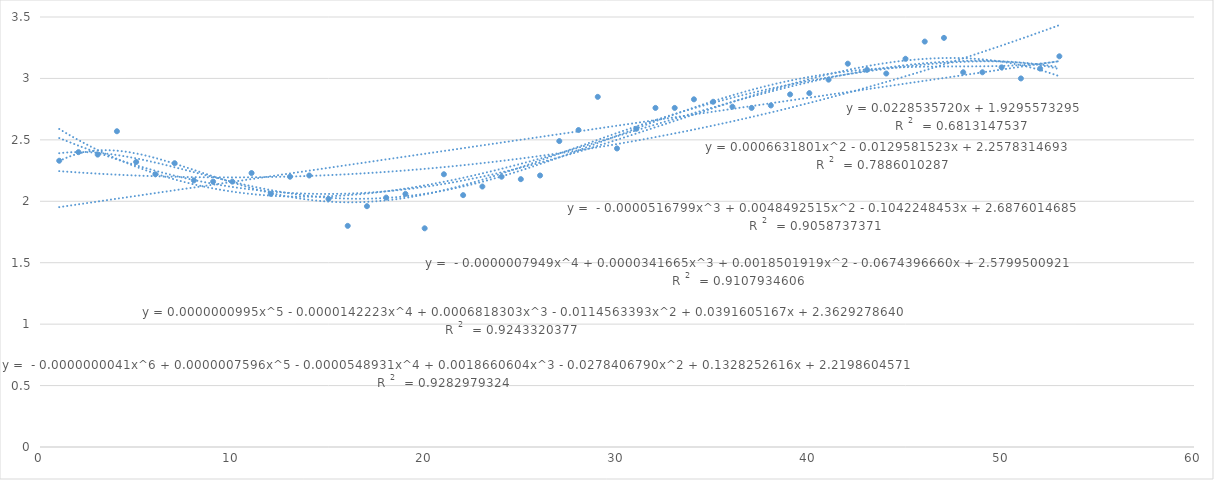
| Category | Series 0 |
|---|---|
| 1.0 | 2.33 |
| 2.0 | 2.4 |
| 3.0 | 2.38 |
| 4.0 | 2.57 |
| 5.0 | 2.32 |
| 6.0 | 2.22 |
| 7.0 | 2.31 |
| 8.0 | 2.17 |
| 9.0 | 2.16 |
| 10.0 | 2.16 |
| 11.0 | 2.23 |
| 12.0 | 2.06 |
| 13.0 | 2.2 |
| 14.0 | 2.21 |
| 15.0 | 2.02 |
| 16.0 | 1.8 |
| 17.0 | 1.96 |
| 18.0 | 2.03 |
| 19.0 | 2.06 |
| 20.0 | 1.78 |
| 21.0 | 2.22 |
| 22.0 | 2.05 |
| 23.0 | 2.12 |
| 24.0 | 2.2 |
| 25.0 | 2.18 |
| 26.0 | 2.21 |
| 27.0 | 2.49 |
| 28.0 | 2.58 |
| 29.0 | 2.85 |
| 30.0 | 2.43 |
| 31.0 | 2.59 |
| 32.0 | 2.76 |
| 33.0 | 2.76 |
| 34.0 | 2.83 |
| 35.0 | 2.81 |
| 36.0 | 2.77 |
| 37.0 | 2.76 |
| 38.0 | 2.78 |
| 39.0 | 2.87 |
| 40.0 | 2.88 |
| 41.0 | 2.99 |
| 42.0 | 3.12 |
| 43.0 | 3.07 |
| 44.0 | 3.04 |
| 45.0 | 3.16 |
| 46.0 | 3.3 |
| 47.0 | 3.33 |
| 48.0 | 3.05 |
| 49.0 | 3.05 |
| 50.0 | 3.09 |
| 51.0 | 3 |
| 52.0 | 3.08 |
| 53.0 | 3.18 |